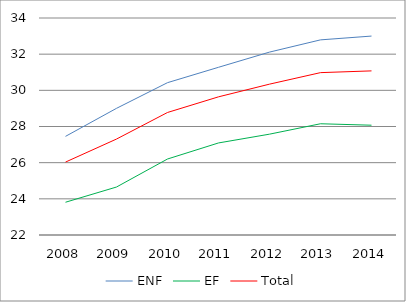
| Category | ENF | EF | Total |
|---|---|---|---|
| 2008.0 | 27.454 | 23.811 | 26.032 |
| 2009.0 | 29.005 | 24.653 | 27.306 |
| 2010.0 | 30.424 | 26.202 | 28.776 |
| 2011.0 | 31.274 | 27.09 | 29.64 |
| 2012.0 | 32.115 | 27.576 | 30.342 |
| 2013.0 | 32.79 | 28.152 | 30.979 |
| 2014.0 | 33.001 | 28.071 | 31.076 |